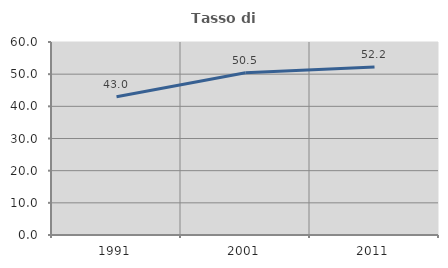
| Category | Tasso di occupazione   |
|---|---|
| 1991.0 | 42.966 |
| 2001.0 | 50.453 |
| 2011.0 | 52.212 |